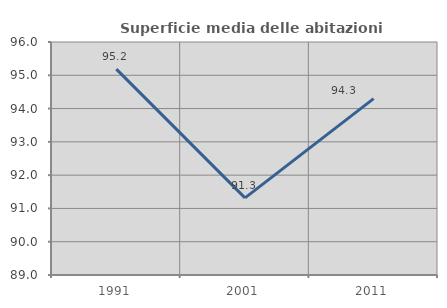
| Category | Superficie media delle abitazioni occupate |
|---|---|
| 1991.0 | 95.186 |
| 2001.0 | 91.316 |
| 2011.0 | 94.298 |